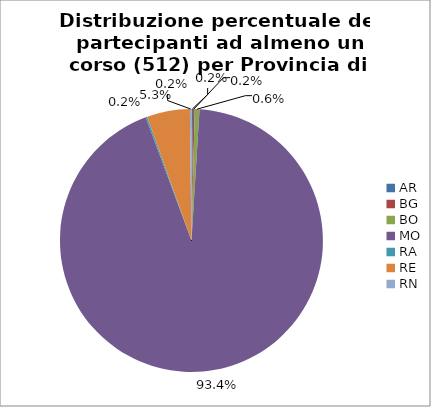
| Category | Nr. Tesserati |
|---|---|
| AR | 1 |
| BG | 1 |
| BO | 3 |
| MO | 478 |
| RA | 1 |
| RE | 27 |
| RN | 1 |